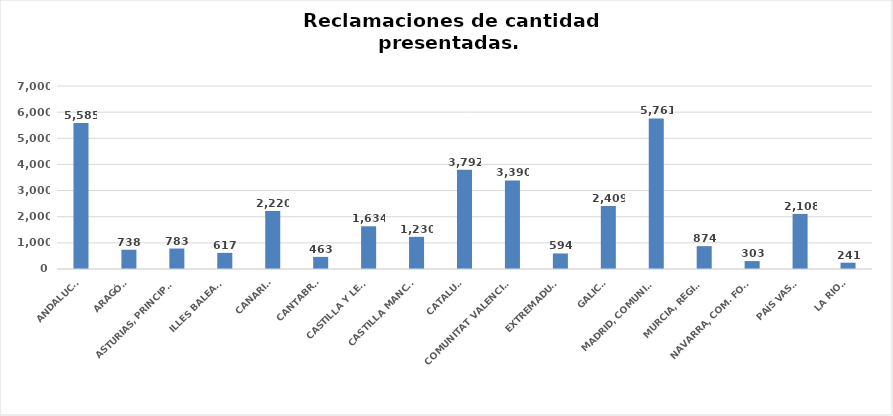
| Category | Series 0 |
|---|---|
| ANDALUCÍA | 5585 |
| ARAGÓN | 738 |
| ASTURIAS, PRINCIPADO | 783 |
| ILLES BALEARS | 617 |
| CANARIAS | 2220 |
| CANTABRIA | 463 |
| CASTILLA Y LEÓN | 1634 |
| CASTILLA MANCHA | 1230 |
| CATALUÑA | 3792 |
| COMUNITAT VALENCIANA | 3390 |
| EXTREMADURA | 594 |
| GALICIA | 2409 |
| MADRID, COMUNIDAD | 5761 |
| MURCIA, REGIÓN | 874 |
| NAVARRA, COM. FORAL | 303 |
| PAÍS VASCO | 2108 |
| LA RIOJA | 241 |